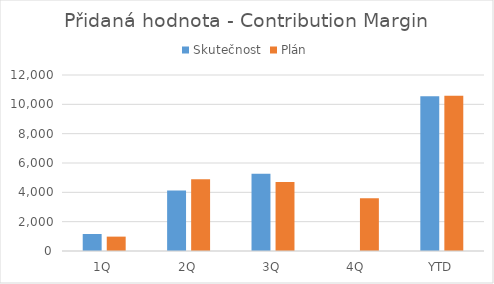
| Category | Skutečnost | Plán |
|---|---|---|
| 1Q | 1158 | 980 |
| 2Q | 4132 | 4900 |
| 3Q | 5260 | 4700 |
| 4Q | 0 | 3600 |
| YTD | 10550 | 10580 |